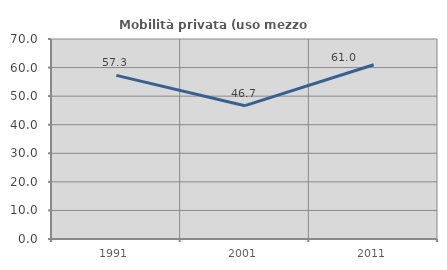
| Category | Mobilità privata (uso mezzo privato) |
|---|---|
| 1991.0 | 57.282 |
| 2001.0 | 46.667 |
| 2011.0 | 60.976 |